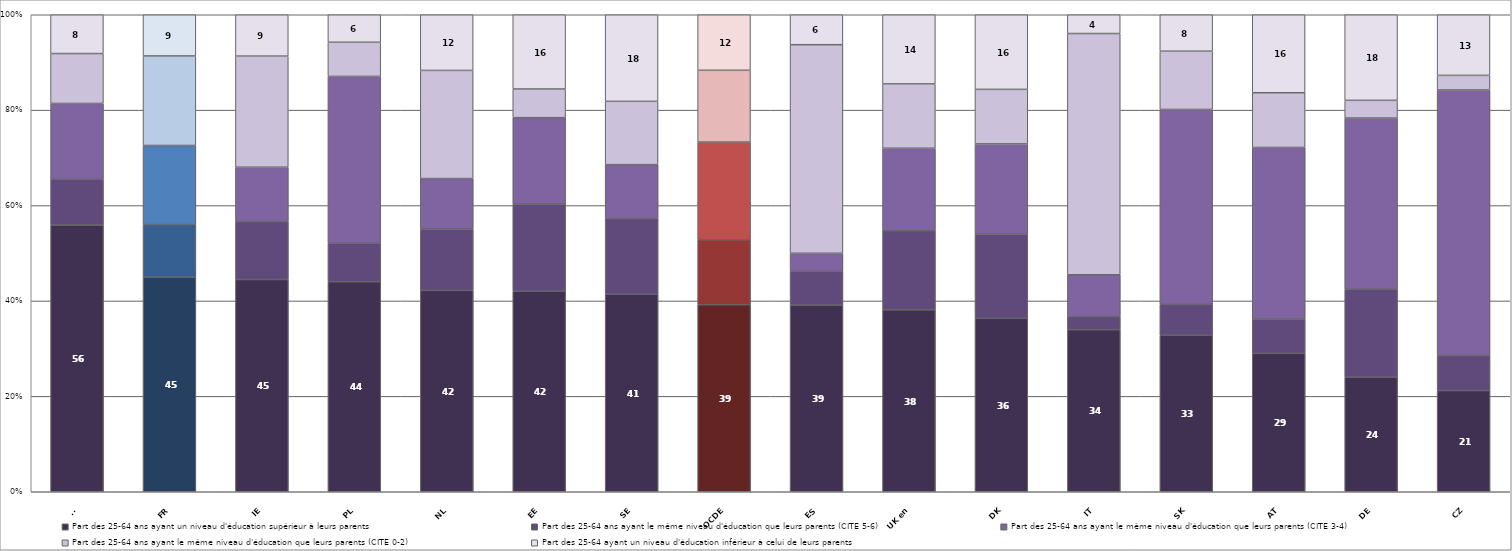
| Category | Part des 25-64 ans ayant un niveau d'éducation supérieur à leurs parents | Part des 25-64 ans ayant le même niveau d'éducation que leurs parents (CITE 5-6) | Part des 25-64 ans ayant le même niveau d'éducation que leurs parents (CITE 3-4) | Part des 25-64 ans ayant le même niveau d'éducation que leurs parents (CITE 0-2) | Part des 25-64 ayant un niveau d'éducation inférieur à celui de leurs parents |
|---|---|---|---|---|---|
| FI | 55.948 | 9.565 | 15.891 | 10.465 | 8.131 |
| FR | 45.002 | 11.021 | 16.567 | 18.771 | 8.639 |
| IE | 44.501 | 12.154 | 11.383 | 23.287 | 8.675 |
| PL | 44.035 | 8.08 | 34.96 | 7.158 | 5.767 |
| NL | 42.212 | 12.882 | 10.566 | 22.671 | 11.669 |
| EE | 42.051 | 18.26 | 18.112 | 6.014 | 15.563 |
| SE | 41.407 | 15.871 | 11.296 | 13.274 | 18.153 |
| OCDE | 39.218 | 13.607 | 20.484 | 15.048 | 11.643 |
| ES | 39.15 | 7.05 | 3.798 | 43.724 | 6.278 |
| UK en | 38.14 | 16.579 | 17.295 | 13.489 | 14.497 |
| DK | 36.363 | 17.646 | 18.917 | 11.431 | 15.643 |
| IT | 33.978 | 2.767 | 8.741 | 50.577 | 3.936 |
| SK | 32.811 | 6.494 | 40.843 | 12.207 | 7.644 |
| AT | 29.015 | 7.198 | 35.965 | 11.471 | 16.351 |
| DE | 24.03 | 18.413 | 35.904 | 3.71 | 17.944 |
| CZ | 21.218 | 7.37 | 55.637 | 3.064 | 12.711 |